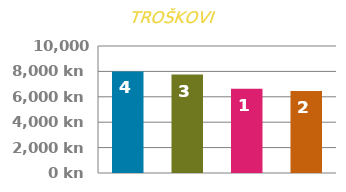
| Category | POČETNI TROŠAK |
|---|---|
| 0 | 8000 |
| 1 | 7750 |
| 2 | 6625 |
| 3 | 6450 |